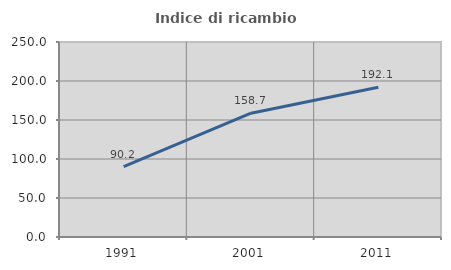
| Category | Indice di ricambio occupazionale  |
|---|---|
| 1991.0 | 90.175 |
| 2001.0 | 158.669 |
| 2011.0 | 192.078 |